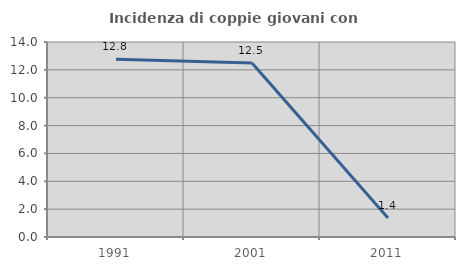
| Category | Incidenza di coppie giovani con figli |
|---|---|
| 1991.0 | 12.766 |
| 2001.0 | 12.5 |
| 2011.0 | 1.37 |